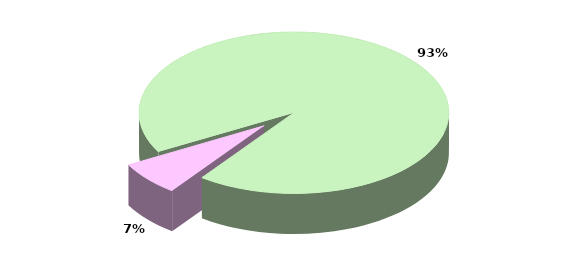
| Category | Series 0 |
|---|---|
| TOTALE ENTRATE CORRENTI | 23016.13 |
| TOTALE ENTRATE IN CONTO CAPITALE | 1684.097 |